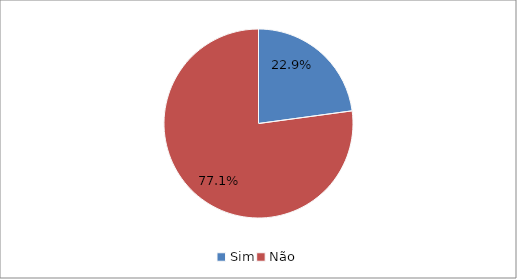
| Category | Series 0 |
|---|---|
| Sim | 0.229 |
| Não | 0.771 |